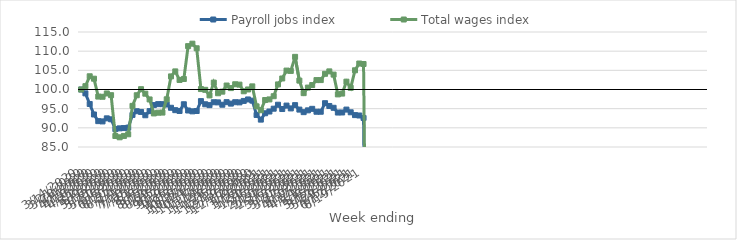
| Category | Payroll jobs index | Total wages index |
|---|---|---|
| 14/03/2020 | 100 | 100 |
| 21/03/2020 | 98.99 | 100.87 |
| 28/03/2020 | 96.224 | 103.449 |
| 04/04/2020 | 93.481 | 102.82 |
| 11/04/2020 | 91.747 | 98.152 |
| 18/04/2020 | 91.675 | 98.103 |
| 25/04/2020 | 92.474 | 98.968 |
| 02/05/2020 | 92.228 | 98.518 |
| 09/05/2020 | 89.673 | 87.872 |
| 16/05/2020 | 89.864 | 87.533 |
| 23/05/2020 | 89.944 | 87.882 |
| 30/05/2020 | 90.05 | 88.316 |
| 06/06/2020 | 93.371 | 95.732 |
| 13/06/2020 | 94.333 | 98.5 |
| 20/06/2020 | 94.147 | 100.078 |
| 27/06/2020 | 93.28 | 98.908 |
| 04/07/2020 | 94.357 | 97.404 |
| 11/07/2020 | 95.936 | 93.759 |
| 18/07/2020 | 96.183 | 93.95 |
| 25/07/2020 | 96.176 | 93.98 |
| 01/08/2020 | 96.076 | 97.441 |
| 08/08/2020 | 95.233 | 103.417 |
| 15/08/2020 | 94.61 | 104.721 |
| 22/08/2020 | 94.4 | 102.49 |
| 29/08/2020 | 96.152 | 102.74 |
| 05/09/2020 | 94.521 | 111.312 |
| 12/09/2020 | 94.3 | 111.955 |
| 19/09/2020 | 94.39 | 110.755 |
| 26/09/2020 | 96.968 | 100.11 |
| 03/10/2020 | 96.147 | 99.917 |
| 10/10/2020 | 95.922 | 98.46 |
| 17/10/2020 | 96.676 | 101.801 |
| 24/10/2020 | 96.638 | 99.022 |
| 31/10/2020 | 96.029 | 99.438 |
| 07/11/2020 | 96.699 | 101.037 |
| 14/11/2020 | 96.317 | 100.366 |
| 21/11/2020 | 96.684 | 101.367 |
| 28/11/2020 | 96.638 | 101.271 |
| 05/12/2020 | 97.019 | 99.537 |
| 12/12/2020 | 97.404 | 100.01 |
| 19/12/2020 | 97.098 | 100.817 |
| 26/12/2020 | 93.357 | 95.603 |
| 02/01/2021 | 92.142 | 94.59 |
| 09/01/2021 | 93.798 | 97.254 |
| 16/01/2021 | 94.254 | 97.415 |
| 23/01/2021 | 94.991 | 98.249 |
| 30/01/2021 | 96.026 | 101.328 |
| 06/02/2021 | 94.908 | 102.876 |
| 13/02/2021 | 95.805 | 104.935 |
| 20/02/2021 | 95.068 | 104.847 |
| 27/02/2021 | 95.922 | 108.517 |
| 06/03/2021 | 94.757 | 102.315 |
| 13/03/2021 | 94.091 | 99.049 |
| 20/03/2021 | 94.562 | 100.505 |
| 27/03/2021 | 94.957 | 101.164 |
| 03/04/2021 | 94.198 | 102.457 |
| 10/04/2021 | 94.198 | 102.457 |
| 17/04/2021 | 96.428 | 104.095 |
| 24/04/2021 | 95.701 | 104.726 |
| 01/05/2021 | 95.226 | 103.884 |
| 08/05/2021 | 93.989 | 98.724 |
| 15/05/2021 | 94.006 | 98.933 |
| 22/05/2021 | 94.761 | 102.039 |
| 29/05/2021 | 94.055 | 100.44 |
| 05/06/2021 | 93.32 | 105.013 |
| 12/06/2021 | 93.221 | 106.777 |
| 19/06/2021 | 92.58 | 106.652 |